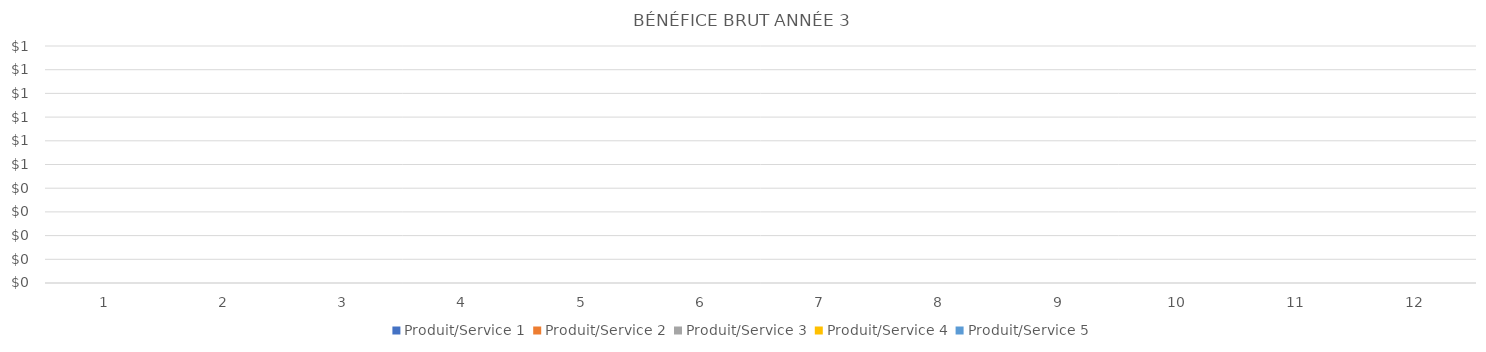
| Category | Produit/Service 1 | Produit/Service 2 | Produit/Service 3 | Produit/Service 4 | Produit/Service 5 |
|---|---|---|---|---|---|
| 0 | 0 | 0 | 0 | 0 | 0 |
| 1 | 0 | 0 | 0 | 0 | 0 |
| 2 | 0 | 0 | 0 | 0 | 0 |
| 3 | 0 | 0 | 0 | 0 | 0 |
| 4 | 0 | 0 | 0 | 0 | 0 |
| 5 | 0 | 0 | 0 | 0 | 0 |
| 6 | 0 | 0 | 0 | 0 | 0 |
| 7 | 0 | 0 | 0 | 0 | 0 |
| 8 | 0 | 0 | 0 | 0 | 0 |
| 9 | 0 | 0 | 0 | 0 | 0 |
| 10 | 0 | 0 | 0 | 0 | 0 |
| 11 | 0 | 0 | 0 | 0 | 0 |